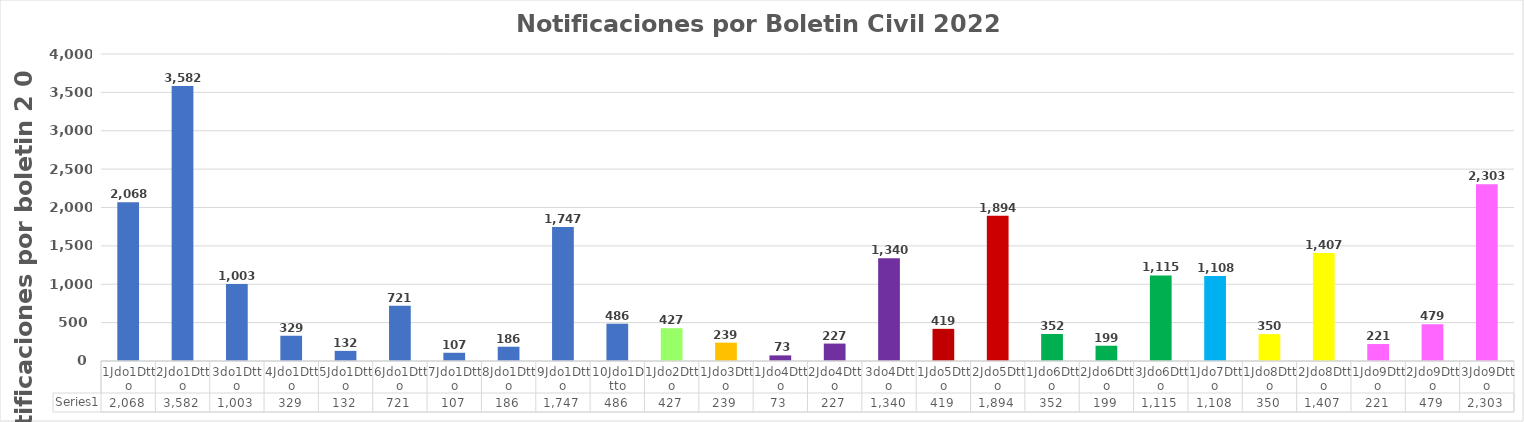
| Category | Series 0 |
|---|---|
| 1Jdo1Dtto | 2068 |
| 2Jdo1Dtto | 3582 |
| 3do1Dtto | 1003 |
| 4Jdo1Dtto | 329 |
| 5Jdo1Dtto | 132 |
| 6Jdo1Dtto | 721 |
| 7Jdo1Dtto | 107 |
| 8Jdo1Dtto | 186 |
| 9Jdo1Dtto | 1747 |
| 10Jdo1Dtto | 486 |
| 1Jdo2Dtto | 427 |
| 1Jdo3Dtto | 239 |
| 1Jdo4Dtto | 73 |
| 2Jdo4Dtto | 227 |
| 3do4Dtto | 1340 |
| 1Jdo5Dtto | 419 |
| 2Jdo5Dtto | 1894 |
| 1Jdo6Dtto | 352 |
| 2Jdo6Dtto | 199 |
| 3Jdo6Dtto | 1115 |
| 1Jdo7Dtto | 1108 |
| 1Jdo8Dtto | 350 |
| 2Jdo8Dtto | 1407 |
| 1Jdo9Dtto | 221 |
| 2Jdo9Dtto | 479 |
| 3Jdo9Dtto | 2303 |